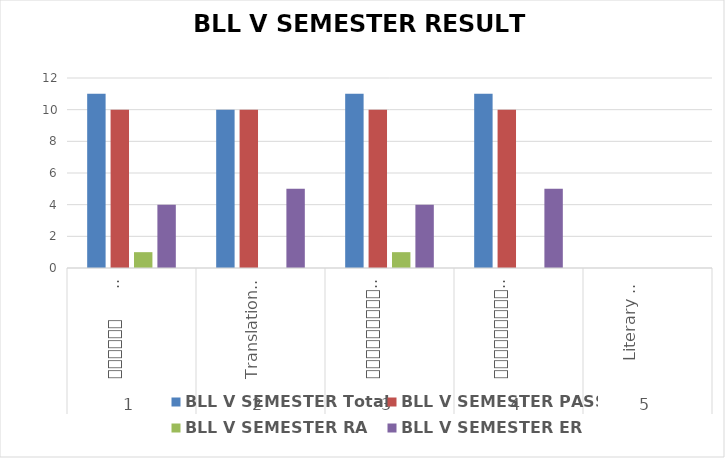
| Category | BLL V SEMESTER Total | BLL V SEMESTER PASS | BLL V SEMESTER RA | BLL V SEMESTER ER |
|---|---|---|---|---|
| 0 | 11 | 10 | 1 | 4 |
| 1 | 10 | 10 | 0 | 5 |
| 2 | 11 | 10 | 1 | 4 |
| 3 | 11 | 10 | 0 | 5 |
| 4 | 0 | 0 | 0 | 0 |